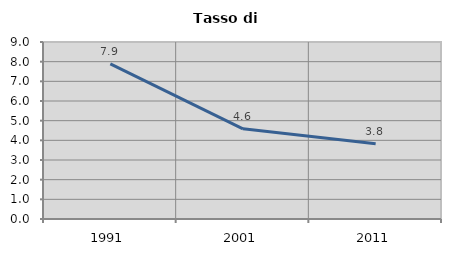
| Category | Tasso di disoccupazione   |
|---|---|
| 1991.0 | 7.888 |
| 2001.0 | 4.586 |
| 2011.0 | 3.828 |